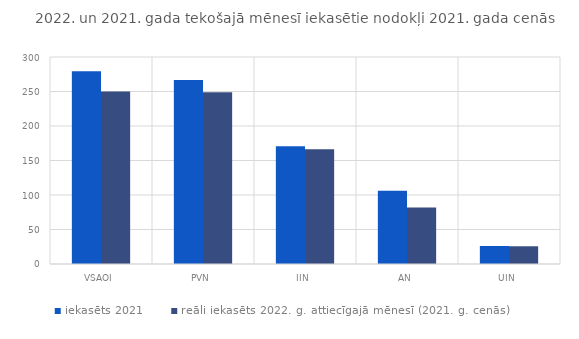
| Category | iekasēts 2021 | reāli iekasēts 2022. g. attiecīgajā mēnesī (2021. g. cenās) |
|---|---|---|
| VSAOI | 279.485 | 249.97 |
| PVN | 266.644 | 249.049 |
| IIN | 170.505 | 166.198 |
| AN | 106.115 | 81.71 |
| UIN | 26.08 | 25.702 |